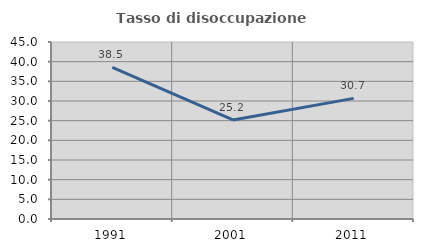
| Category | Tasso di disoccupazione giovanile  |
|---|---|
| 1991.0 | 38.542 |
| 2001.0 | 25.189 |
| 2011.0 | 30.67 |